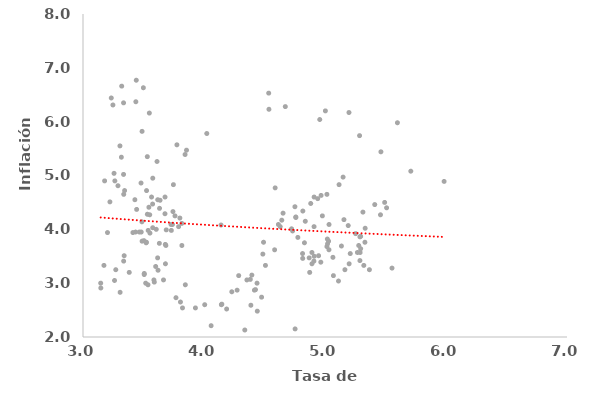
| Category | Series 0 |
|---|---|
| 3.636755075451 | 4.54 |
| 3.551407384229 | 4.27 |
| 3.632562846344 | 4.39 |
| 3.566520086992 | 4.6 |
| 3.677917685002 | 4.6 |
| 3.743498910418 | 4.33 |
| 3.575231893725 | 4.47 |
| 3.434788330244 | 3.95 |
| 3.340362617098 | 3.51 |
| 3.260734633069 | 3.05 |
| 3.147302571141 | 2.91 |
| 3.173327092904 | 3.33 |
| 3.202334785867 | 3.94 |
| 3.5218073054139998 | 3.75 |
| 3.335968550554 | 3.41 |
| 3.382289959599 | 3.2 |
| 3.146376340557 | 3 |
| 3.506269509183 | 3.18 |
| 3.66525914218 | 3.06 |
| 3.616748951211 | 3.47 |
| 3.727625757521 | 4.09 |
| 3.677396772077 | 4.29 |
| 3.739330443662 | 4.09 |
| 3.790183583541 | 4.05 |
| 3.730108997 | 3.98 |
| 3.816746826182 | 4.11 |
| 3.80054906403 | 4.21 |
| 3.688204571884 | 3.99 |
| 3.465787348674 | 3.95 |
| 3.538455583808 | 3.98 |
| 3.487016914085 | 4.14 |
| 3.576317514046 | 4.03 |
| 3.503364823922 | 3.79 |
| 3.631091459426 | 3.74 |
| 3.55324857923 | 3.93 |
| 3.524255259055 | 3.76 |
| 3.817062512455 | 3.7 |
| 3.680310339228 | 3.72 |
| 3.760275125427 | 4.25 |
| 3.617664159624 | 4.55 |
| 3.576600983859 | 4.95 |
| 3.611667298808 | 5.26 |
| 3.843556222457 | 5.39 |
| 3.776113797965 | 5.57 |
| 3.855476447178 | 5.47 |
| 4.023080548475 | 5.78 |
| 4.536740523036 | 6.23 |
| 4.534791293367 | 6.53 |
| 4.671996861529 | 6.28 |
| 5.003211615659 | 6.2 |
| 4.956673154601 | 6.04 |
| 5.19811802376 | 6.17 |
| 5.598531370192 | 5.98 |
| 5.285655679778 | 5.74 |
| 5.462130923632 | 5.44 |
| 5.709113210652 | 5.08 |
| 5.984429928574 | 4.89 |
| 5.49290958858 | 4.5 |
| 5.28860770517 | 3.86 |
| 5.290374385779 | 3.57 |
| 5.411109539509 | 4.46 |
| 5.116237378877 | 4.83 |
| 5.149484985416 | 4.97 |
| 5.458391086111 | 4.27 |
| 5.253250825102 | 3.92 |
| 5.135948733168 | 3.69 |
| 5.294778583115 | 3.64 |
| 5.015923424539 | 3.68 |
| 5.278618031883 | 3.7 |
| 5.332000275831 | 4.02 |
| 5.313459502735 | 4.32 |
| 5.508987775258 | 4.4 |
| 5.029556328343 | 3.78 |
| 5.267967054631 | 3.57 |
| 5.111592072362 | 3.04 |
| 5.199583906435 | 3.36 |
| 5.367233085946 | 3.25 |
| 5.553838013083 | 3.28 |
| 5.208795585994 | 3.55 |
| 5.288783692502 | 3.42 |
| 5.069578502403 | 3.14 |
| 4.873570411637 | 3.2 |
| 5.065582892949 | 3.48 |
| 5.019365292459 | 3.82 |
| 4.629649584343 | 4.05 |
| 5.294538738583 | 3.87 |
| 5.020894463362 | 3.73 |
| 4.908364963954 | 3.41 |
| 4.775783899051 | 3.85 |
| 4.816791047749 | 4.34 |
| 4.751328891787 | 4.42 |
| 4.939636822335 | 4.57 |
| 4.58821056343 | 4.77 |
| 4.90991886618 | 4.6 |
| 5.156644503712 | 4.18 |
| 4.891907968598 | 3.57 |
| 5.164586634969 | 3.25 |
| 4.814513835867 | 3.55 |
| 4.978154306613 | 4.25 |
| 5.015881883255 | 4.65 |
| 4.967871614648 | 4.63 |
| 5.033443790191 | 4.09 |
| 4.869507377796 | 3.47 |
| 4.815880641791 | 3.46 |
| 4.965227804926 | 3.39 |
| 4.892290914008 | 3.36 |
| 4.583596230228 | 3.62 |
| 4.732163339102 | 3.97 |
| 4.88213822052 | 4.48 |
| 4.758600296909 | 4.23 |
| 5.329997189043 | 3.76 |
| 4.910773638489 | 3.5 |
| 4.947092726046 | 3.51 |
| 4.830182470967 | 3.75 |
| 5.191914614689 | 4.07 |
| 4.837069152081 | 4.15 |
| 4.759057331362 | 4.22 |
| 4.653415457934 | 4.3 |
| 4.642849127441 | 4.17 |
| 4.140762858054 | 4.08 |
| 4.382678334289 | 3.07 |
| 4.438292712358 | 3 |
| 4.286888951392 | 3.14 |
| 4.354400340019 | 3.06 |
| 4.425608163968 | 2.88 |
| 4.416725669413 | 2.87 |
| 4.475984849273 | 2.74 |
| 4.387449526565 | 2.59 |
| 4.186908993559 | 2.52 |
| 4.440404296224 | 2.48 |
| 4.058892113814 | 2.21 |
| 4.337122162554 | 2.13 |
| 4.147371063156 | 2.61 |
| 4.273788710107 | 2.87 |
| 4.14337792218 | 2.6 |
| 3.822217183614 | 2.54 |
| 4.005933539106 | 2.6 |
| 3.929109191137 | 2.54 |
| 3.805589529205 | 2.65 |
| 3.768389941351 | 2.73 |
| 3.845669929923 | 2.97 |
| 3.585906417481 | 3.06 |
| 3.600546424524 | 3.31 |
| 3.681421732757 | 3.36 |
| 3.525269827484 | 4.72 |
| 3.47967405922 | 4.86 |
| 3.531495246182 | 5.35 |
| 3.488041413715 | 5.82 |
| 3.548130398367 | 6.16 |
| 3.24728434717 | 6.31 |
| 3.233688887159 | 6.44 |
| 3.319826161832 | 6.66 |
| 3.335184580987 | 6.35 |
| 3.436671438044 | 6.37 |
| 3.498808675082 | 6.63 |
| 3.440306976657 | 6.77 |
| 3.305314475629 | 5.55 |
| 3.317243517262 | 5.34 |
| 3.256450103018 | 5.04 |
| 3.42874841543 | 4.55 |
| 3.222450456902 | 4.51 |
| 3.336629648725 | 4.65 |
| 3.288935625042 | 4.81 |
| 3.263201937873 | 4.9 |
| 3.335066060771 | 5.02 |
| 3.178546604848 | 4.9 |
| 3.343911894121 | 4.72 |
| 3.747173706252 | 4.83 |
| 3.443283046109 | 4.37 |
| 3.412530027204 | 3.94 |
| 3.605424236178 | 4 |
| 3.544285254186 | 4.41 |
| 3.531811179145 | 4.28 |
| 3.48134383688 | 3.95 |
| 3.48843411707 | 3.78 |
| 3.505990224856 | 3.16 |
| 3.518185903889 | 3 |
| 3.589263075913 | 3.02 |
| 3.537178136291 | 2.97 |
| 3.306722209428 | 2.83 |
| 3.620080203888 | 3.24 |
| 3.685131244491 | 3.7 |
| 3.270919273084 | 3.25 |
| 4.752961537568 | 2.15 |
| 4.229822907557 | 2.84 |
| 5.320834514096 | 3.33 |
| 5.032699914332 | 3.62 |
| 4.909474451912 | 4.05 |
| 4.723730102758 | 4.01 |
| 4.614652533956 | 4.09 |
| 4.507934480135 | 3.33 |
| 4.395503645327 | 3.15 |
| 4.486328249782 | 3.54 |
| 4.492174686135 | 3.76 |